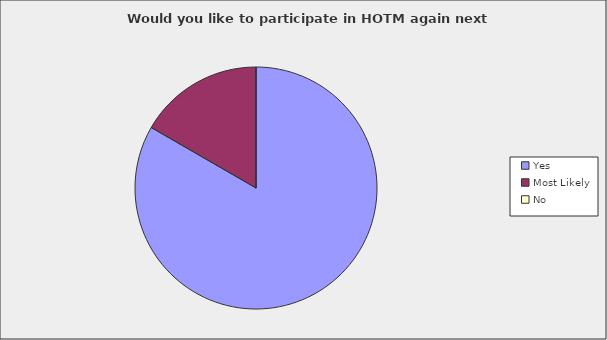
| Category | Series 0 |
|---|---|
| Yes | 0.833 |
| Most Likely | 0.167 |
| No | 0 |